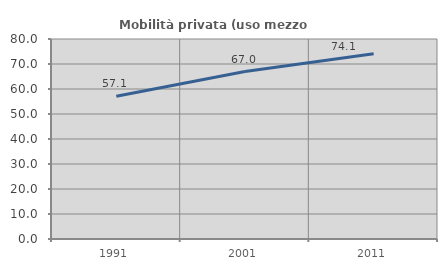
| Category | Mobilità privata (uso mezzo privato) |
|---|---|
| 1991.0 | 57.085 |
| 2001.0 | 66.986 |
| 2011.0 | 74.129 |